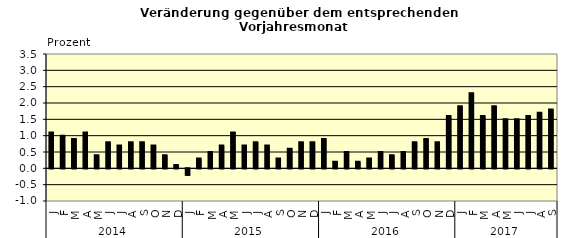
| Category | Series 0 |
|---|---|
| 0 | 1.1 |
| 1 | 1 |
| 2 | 0.9 |
| 3 | 1.1 |
| 4 | 0.4 |
| 5 | 0.8 |
| 6 | 0.7 |
| 7 | 0.8 |
| 8 | 0.8 |
| 9 | 0.7 |
| 10 | 0.4 |
| 11 | 0.1 |
| 12 | -0.2 |
| 13 | 0.3 |
| 14 | 0.5 |
| 15 | 0.7 |
| 16 | 1.1 |
| 17 | 0.7 |
| 18 | 0.8 |
| 19 | 0.7 |
| 20 | 0.3 |
| 21 | 0.6 |
| 22 | 0.8 |
| 23 | 0.8 |
| 24 | 0.9 |
| 25 | 0.2 |
| 26 | 0.5 |
| 27 | 0.2 |
| 28 | 0.3 |
| 29 | 0.5 |
| 30 | 0.4 |
| 31 | 0.5 |
| 32 | 0.8 |
| 33 | 0.9 |
| 34 | 0.8 |
| 35 | 1.6 |
| 36 | 1.9 |
| 37 | 2.3 |
| 38 | 1.6 |
| 39 | 1.9 |
| 40 | 1.5 |
| 41 | 1.5 |
| 42 | 1.6 |
| 43 | 1.7 |
| 44 | 1.8 |